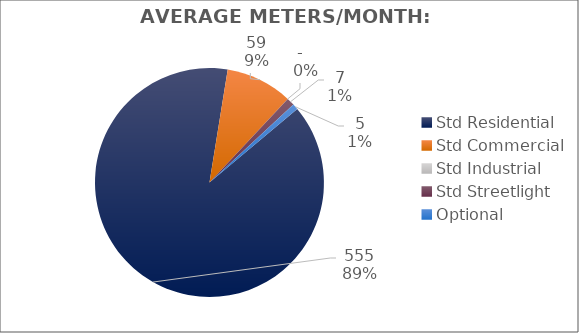
| Category | Meters |
|---|---|
| Std Residential | 555 |
| Std Commercial | 59 |
| Std Industrial | 0 |
| Std Streetlight | 7 |
| Optional | 5 |